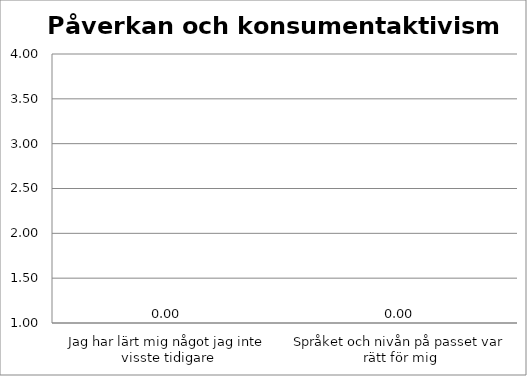
| Category | Series 0 |
|---|---|
| Jag har lärt mig något jag inte visste tidigare | 0 |
| Språket och nivån på passet var rätt för mig | 0 |